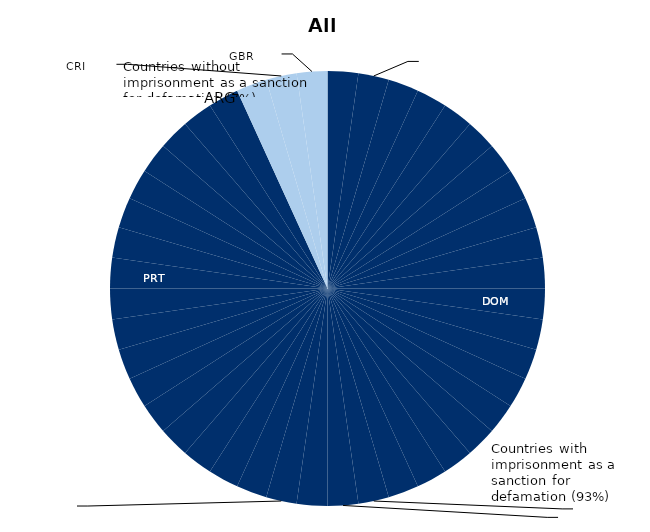
| Category | Series 0 |
|---|---|
| 0 | 1 |
| 1 | 1 |
| 2 | 1 |
| 3 | 1 |
| 4 | 1 |
| 5 | 1 |
| 6 | 1 |
| 7 | 1 |
| 8 | 1 |
| 9 | 1 |
| 10 | 1 |
| 11 | 1 |
| 12 | 1 |
| 13 | 1 |
| 14 | 1 |
| 15 | 1 |
| 16 | 1 |
| 17 | 1 |
| 18 | 1 |
| 19 | 1 |
| 20 | 1 |
| 21 | 1 |
| 22 | 1 |
| 23 | 1 |
| 24 | 1 |
| 25 | 1 |
| 26 | 1 |
| 27 | 1 |
| 28 | 1 |
| 29 | 1 |
| 30 | 1 |
| 31 | 1 |
| 32 | 1 |
| 33 | 1 |
| 34 | 1 |
| 35 | 1 |
| 36 | 1 |
| 37 | 1 |
| 38 | 1 |
| 39 | 1 |
| 40 | 1 |
| 41 | 1 |
| 42 | 1 |
| 43 | 1 |